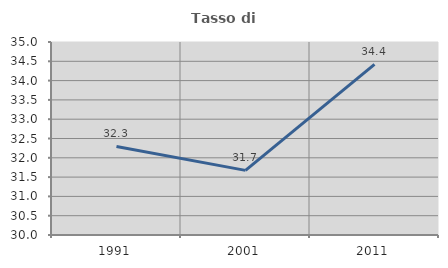
| Category | Tasso di occupazione   |
|---|---|
| 1991.0 | 32.295 |
| 2001.0 | 31.675 |
| 2011.0 | 34.421 |